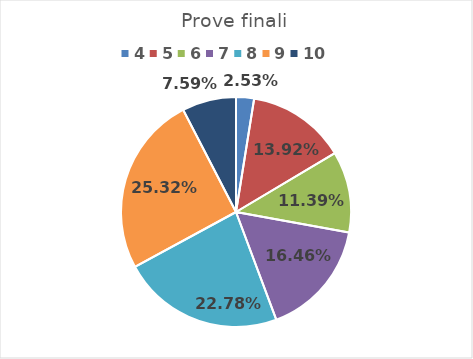
| Category | Series 0 |
|---|---|
| 4.0 | 0.025 |
| 5.0 | 0.139 |
| 6.0 | 0.114 |
| 7.0 | 0.165 |
| 8.0 | 0.228 |
| 9.0 | 0.253 |
| 10.0 | 0.076 |